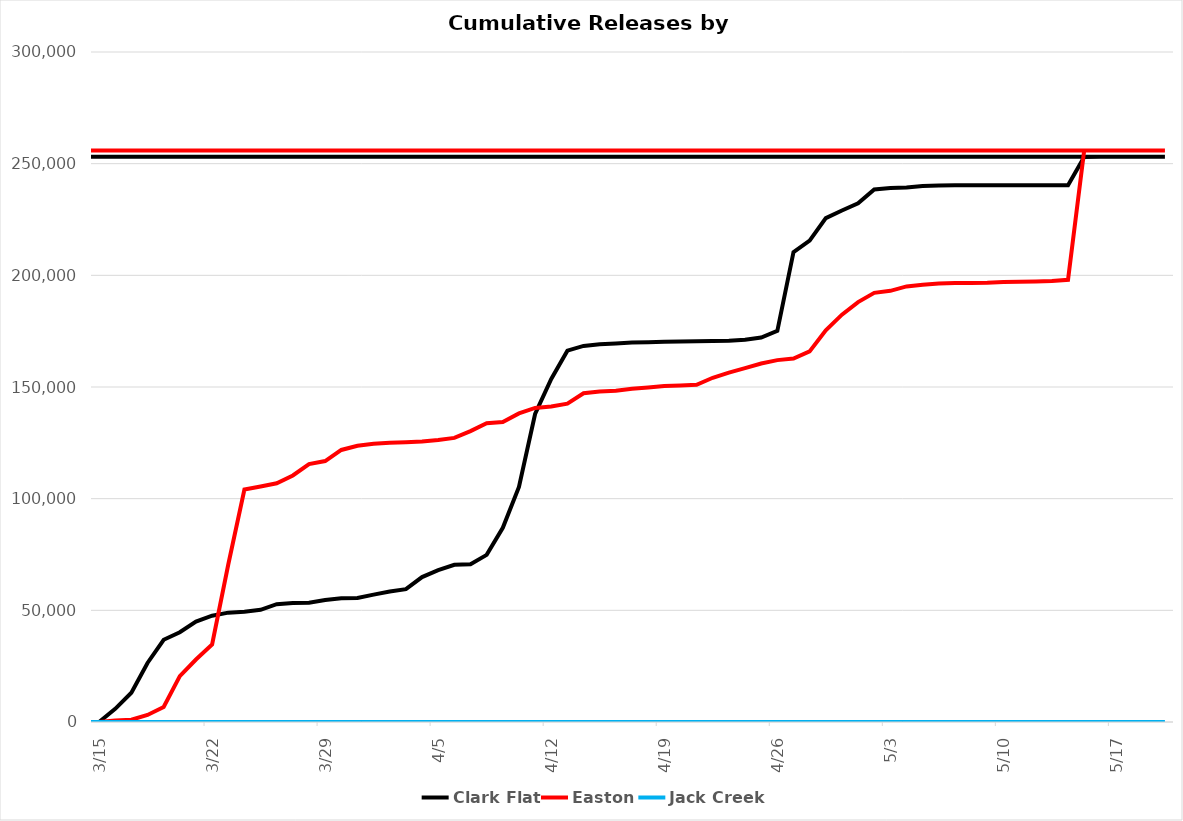
| Category | Clark Flat | Easton | Jack Creek |
|---|---|---|---|
| 2023-03-15 | 0 | 0 | 0 |
| 2023-03-16 | 5897 | 641 | 0 |
| 2023-03-17 | 13134 | 1052 | 0 |
| 2023-03-18 | 26446 | 3133 | 0 |
| 2023-03-19 | 36827 | 6751 | 0 |
| 2023-03-20 | 40186 | 20567 | 0 |
| 2023-03-21 | 45000 | 27983 | 0 |
| 2023-03-22 | 47615 | 34752 | 0 |
| 2023-03-23 | 48967 | 70518 | 0 |
| 2023-03-24 | 49387 | 104077 | 0 |
| 2023-03-25 | 50212 | 105472 | 0 |
| 2023-03-26 | 52740 | 106905 | 0 |
| 2023-03-27 | 53294 | 110394 | 0 |
| 2023-03-28 | 53358 | 115512 | 0 |
| 2023-03-29 | 54595 | 116852 | 0 |
| 2023-03-30 | 55444 | 121813 | 0 |
| 2023-03-31 | 55544 | 123707 | 0 |
| 2023-04-01 | 57052 | 124614 | 0 |
| 2023-04-02 | 58423 | 125011 | 0 |
| 2023-04-03 | 59486 | 125247 | 0 |
| 2023-04-04 | 64896 | 125573 | 0 |
| 2023-04-05 | 67977 | 126228 | 0 |
| 2023-04-06 | 70371 | 127203 | 0 |
| 2023-04-07 | 70640 | 130233 | 0 |
| 2023-04-08 | 74827 | 133810 | 0 |
| 2023-04-09 | 86937 | 134333 | 0 |
| 2023-04-10 | 105246 | 138154 | 0 |
| 2023-04-11 | 137934 | 140630 | 0 |
| 2023-04-12 | 153603 | 141230 | 0 |
| 2023-04-13 | 166273 | 142516 | 0 |
| 2023-04-14 | 168393 | 147184 | 0 |
| 2023-04-15 | 169157 | 147971 | 0 |
| 2023-04-16 | 169523 | 148354 | 0 |
| 2023-04-17 | 169949 | 149197 | 0 |
| 2023-04-18 | 170053 | 149772 | 0 |
| 2023-04-19 | 170254 | 150477 | 0 |
| 2023-04-20 | 170319 | 150709 | 0 |
| 2023-04-21 | 170479 | 151005 | 0 |
| 2023-04-22 | 170558 | 154139 | 0 |
| 2023-04-23 | 170686 | 156473 | 0 |
| 2023-04-24 | 171129 | 158464 | 0 |
| 2023-04-25 | 172164 | 160542 | 0 |
| 2023-04-26 | 175157 | 162036 | 0 |
| 2023-04-27 | 210402 | 162775 | 0 |
| 2023-04-28 | 215553 | 165958 | 0 |
| 2023-04-29 | 225601 | 175349 | 0 |
| 2023-04-30 | 229002 | 182396 | 0 |
| 2023-05-01 | 232228 | 188028 | 0 |
| 2023-05-02 | 238436 | 192172 | 0 |
| 2023-05-03 | 239119 | 193071 | 0 |
| 2023-05-04 | 239325 | 195034 | 0 |
| 2023-05-05 | 240026 | 195770 | 0 |
| 2023-05-06 | 240263 | 196297 | 0 |
| 2023-05-07 | 240284 | 196530 | 0 |
| 2023-05-08 | 240294 | 196553 | 0 |
| 2023-05-09 | 240317 | 196715 | 0 |
| 2023-05-10 | 240327 | 197066 | 0 |
| 2023-05-11 | 240337 | 197160 | 0 |
| 2023-05-12 | 240337 | 197276 | 0 |
| 2023-05-13 | 240347 | 197458 | 0 |
| 2023-05-14 | 240358 | 198007 | 0 |
| 2023-05-15 | 253007 | 255886 | 0 |
| 2023-05-16 | 253098 | 255886 | 0 |
| 2023-05-17 | 253098 | 255886 | 0 |
| 2023-05-18 | 253098 | 255886 | 0 |
| 2023-05-19 | 253098 | 255886 | 0 |
| 2023-05-20 | 253098 | 255909 | 0 |
| nan | 253098 | 255909 | 0 |